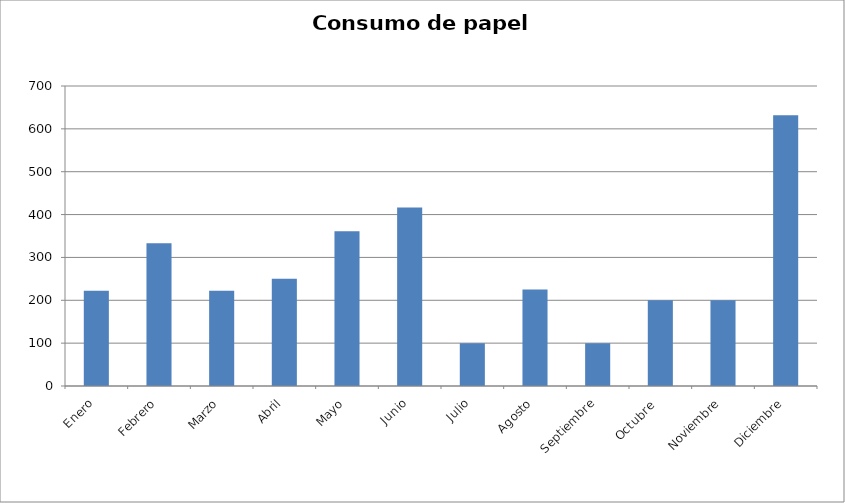
| Category | Series 0 |
|---|---|
| Enero | 222.222 |
| Febrero | 333.333 |
| Marzo | 222.222 |
| Abril | 250 |
| Mayo | 361.111 |
| Junio | 416.667 |
| Julio | 100 |
| Agosto | 225 |
| Septiembre | 100 |
| Octubre  | 200 |
| Noviembre | 200 |
| Diciembre | 631.579 |